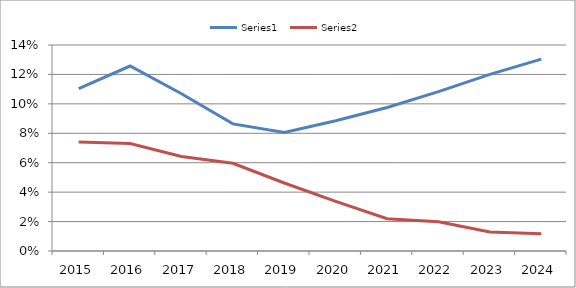
| Category | Series 0 | Series 1 |
|---|---|---|
| 2015.0 | 0.11 | 0.074 |
| 2016.0 | 0.126 | 0.073 |
| 2017.0 | 0.107 | 0.064 |
| 2018.0 | 0.086 | 0.06 |
| 2019.0 | 0.081 | 0.046 |
| 2020.0 | 0.088 | 0.034 |
| 2021.0 | 0.098 | 0.022 |
| 2022.0 | 0.108 | 0.02 |
| 2023.0 | 0.12 | 0.013 |
| 2024.0 | 0.13 | 0.012 |